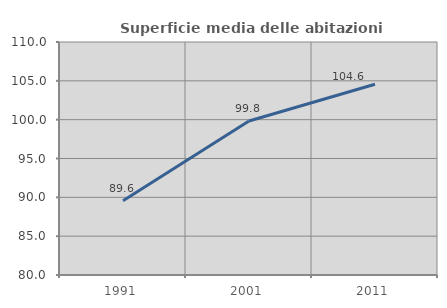
| Category | Superficie media delle abitazioni occupate |
|---|---|
| 1991.0 | 89.562 |
| 2001.0 | 99.833 |
| 2011.0 | 104.559 |